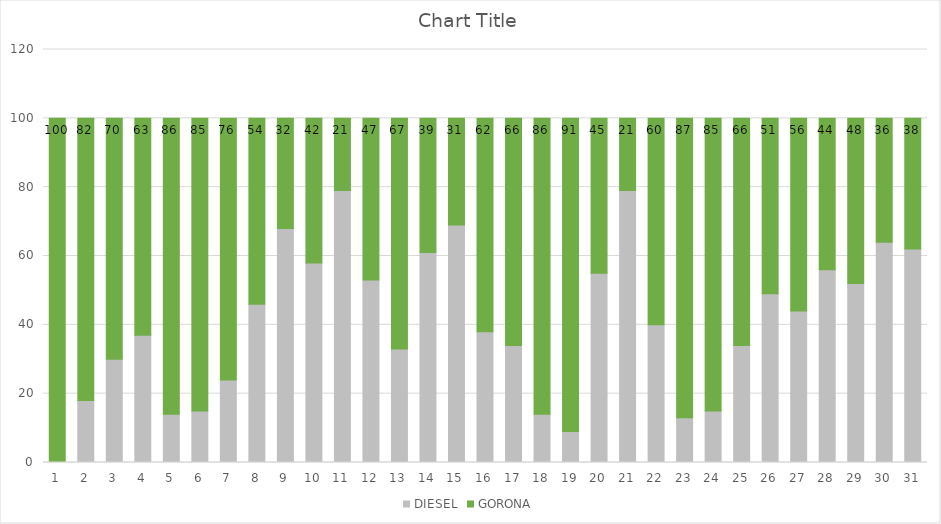
| Category | DIESEL | GORONA |
|---|---|---|
| 1.0 | 0 | 100 |
| 2.0 | 18 | 82 |
| 3.0 | 30 | 70 |
| 4.0 | 37 | 63 |
| 5.0 | 14 | 86 |
| 6.0 | 15 | 85 |
| 7.0 | 24 | 76 |
| 8.0 | 46 | 54 |
| 9.0 | 68 | 32 |
| 10.0 | 58 | 42 |
| 11.0 | 79 | 21 |
| 12.0 | 53 | 47 |
| 13.0 | 33 | 67 |
| 14.0 | 61 | 39 |
| 15.0 | 69 | 31 |
| 16.0 | 38 | 62 |
| 17.0 | 34 | 66 |
| 18.0 | 14 | 86 |
| 19.0 | 9 | 91 |
| 20.0 | 55 | 45 |
| 21.0 | 79 | 21 |
| 22.0 | 40 | 60 |
| 23.0 | 13 | 87 |
| 24.0 | 15 | 85 |
| 25.0 | 34 | 66 |
| 26.0 | 49 | 51 |
| 27.0 | 44 | 56 |
| 28.0 | 56 | 44 |
| 29.0 | 52 | 48 |
| 30.0 | 64 | 36 |
| 31.0 | 62 | 38 |